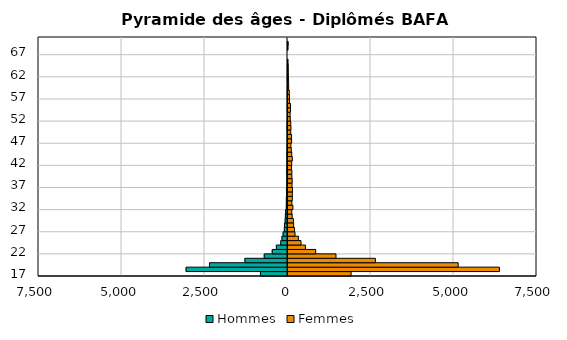
| Category | Hommes | Femmes |
|---|---|---|
| 17.0 | -814 | 1901 |
| 18.0 | -3055 | 6369 |
| 19.0 | -2350 | 5126 |
| 20.0 | -1283 | 2633 |
| 21.0 | -701 | 1445 |
| 22.0 | -460 | 834 |
| 23.0 | -335 | 525 |
| 24.0 | -203 | 392 |
| 25.0 | -168 | 313 |
| 26.0 | -132 | 211 |
| 27.0 | -95 | 194 |
| 28.0 | -89 | 169 |
| 29.0 | -71 | 162 |
| 30.0 | -63 | 126 |
| 31.0 | -57 | 114 |
| 32.0 | -36 | 148 |
| 33.0 | -34 | 116 |
| 34.0 | -34 | 131 |
| 35.0 | -25 | 130 |
| 36.0 | -31 | 135 |
| 37.0 | -19 | 121 |
| 38.0 | -21 | 127 |
| 39.0 | -18 | 117 |
| 40.0 | -22 | 116 |
| 41.0 | -19 | 105 |
| 42.0 | -15 | 112 |
| 43.0 | -15 | 130 |
| 44.0 | -20 | 113 |
| 45.0 | -12 | 100 |
| 46.0 | -13 | 87 |
| 47.0 | -7 | 108 |
| 48.0 | -7 | 108 |
| 49.0 | -6 | 82 |
| 50.0 | -15 | 89 |
| 51.0 | -9 | 83 |
| 52.0 | -5 | 68 |
| 53.0 | -2 | 63 |
| 54.0 | -6 | 77 |
| 55.0 | -6 | 76 |
| 56.0 | -4 | 44 |
| 57.0 | -6 | 44 |
| 58.0 | -5 | 39 |
| 59.0 | -1 | 20 |
| 60.0 | 0 | 19 |
| 61.0 | -4 | 13 |
| 62.0 | -1 | 9 |
| 63.0 | -2 | 5 |
| 64.0 | -1 | 3 |
| 65.0 | 0 | 1 |
| 66.0 | 0 | 0 |
| 67.0 | 0 | 0 |
| 68.0 | 0 | 1 |
| 69.0 | -1 | 1 |
| 70.0 | 0 | 0 |